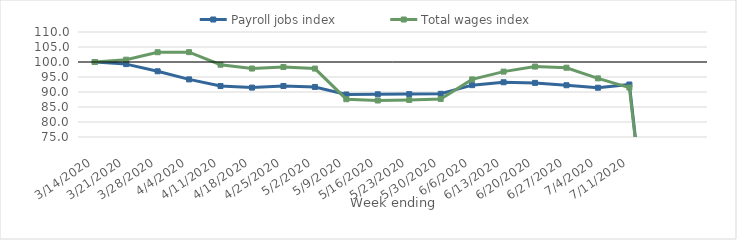
| Category | Payroll jobs index | Total wages index |
|---|---|---|
| 14/03/2020 | 100 | 100 |
| 21/03/2020 | 99.292 | 100.772 |
| 28/03/2020 | 96.908 | 103.25 |
| 04/04/2020 | 94.203 | 103.277 |
| 11/04/2020 | 91.979 | 99.097 |
| 18/04/2020 | 91.468 | 97.821 |
| 25/04/2020 | 92.009 | 98.343 |
| 02/05/2020 | 91.682 | 97.805 |
| 09/05/2020 | 89.17 | 87.604 |
| 16/05/2020 | 89.243 | 87.159 |
| 23/05/2020 | 89.297 | 87.346 |
| 30/05/2020 | 89.393 | 87.689 |
| 06/06/2020 | 92.282 | 94.199 |
| 13/06/2020 | 93.246 | 96.787 |
| 20/06/2020 | 93.038 | 98.477 |
| 27/06/2020 | 92.255 | 98.098 |
| 04/07/2020 | 91.424 | 94.538 |
| 11/07/2020 | 92.498 | 91.474 |